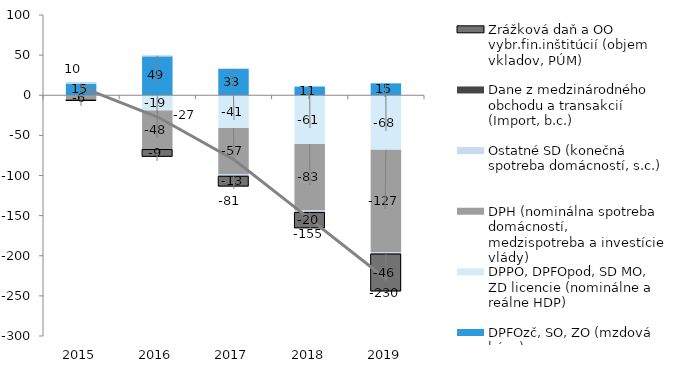
| Category | DPFOzč, SO, ZO (mzdová báza) | DPPO, DPFOpod, SD MO, ZD licencie (nominálne a reálne HDP) | DPH (nominálna spotreba domácností, medzispotreba a investície vlády) | Ostatné SD (konečná spotreba domácností, s.c.) | Dane z medzinárodného obchodu a transakcií (Import, b.c.) | Zrážková daň a OO vybr.fin.inštitúcií (objem vkladov, PÚM) |
|---|---|---|---|---|---|---|
| 2015.0 | 14.603 | 0.979 | -6.393 | 0.977 | -0.089 | -0.305 |
| 2016.0 | 49.299 | -19.138 | -48.009 | 0.04 | -0.544 | -9.064 |
| 2017.0 | 33.037 | -40.933 | -57.161 | -2.215 | -0.706 | -12.771 |
| 2018.0 | 10.867 | -60.728 | -82.779 | -1.833 | -0.816 | -19.617 |
| 2019.0 | 14.846 | -68.05 | -127.345 | -1.791 | -0.817 | -46.4 |